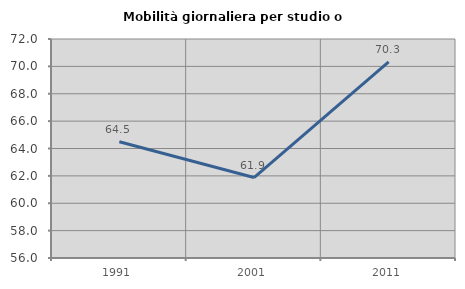
| Category | Mobilità giornaliera per studio o lavoro |
|---|---|
| 1991.0 | 64.498 |
| 2001.0 | 61.879 |
| 2011.0 | 70.326 |